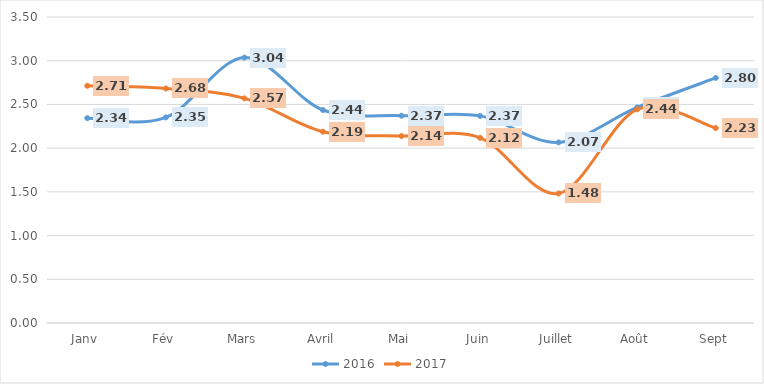
| Category | 2016 | 2017 |
|---|---|---|
| Janv | 2.343 | 2.713 |
| Fév | 2.351 | 2.682 |
| Mars | 3.036 | 2.569 |
| Avril | 2.436 | 2.188 |
| Mai | 2.371 | 2.139 |
| Juin | 2.369 | 2.118 |
| Juillet | 2.066 | 1.482 |
| Août | 2.466 | 2.444 |
| Sept | 2.803 | 2.23 |